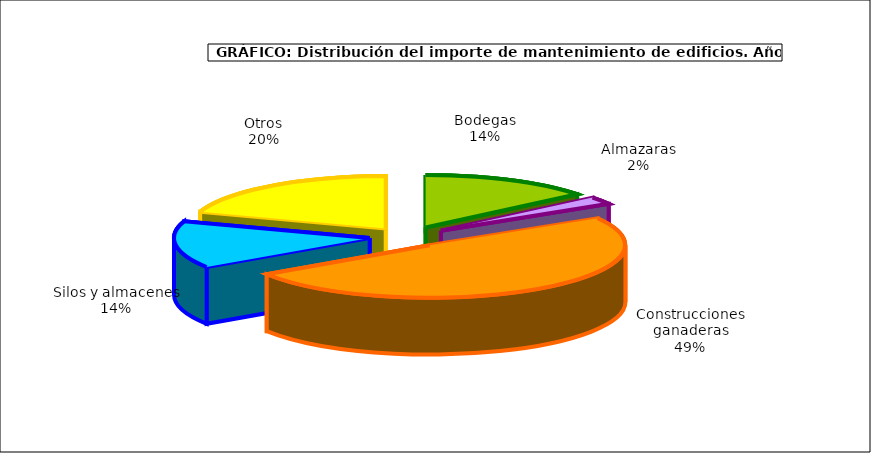
| Category | Series 0 |
|---|---|
| 0 | 79.323 |
| 1 | 12.878 |
| 2 | 277.271 |
| 3 | 81.384 |
| 4 | 111.727 |